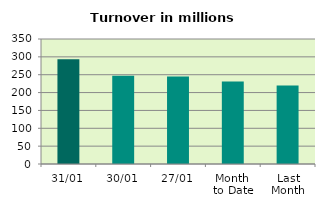
| Category | Series 0 |
|---|---|
| 31/01 | 293.136 |
| 30/01 | 247.398 |
| 27/01 | 245.344 |
| Month 
to Date | 231.348 |
| Last
Month | 219.947 |